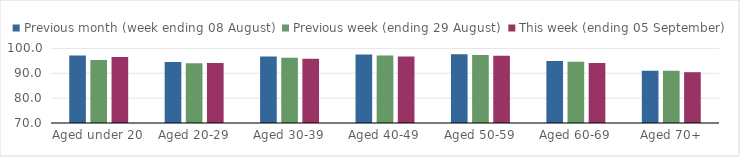
| Category | Previous month (week ending 08 August) | Previous week (ending 29 August) | This week (ending 05 September) |
|---|---|---|---|
| Aged under 20 | 97.14 | 95.33 | 96.56 |
| Aged 20-29 | 94.51 | 94.06 | 94.1 |
| Aged 30-39 | 96.75 | 96.28 | 95.89 |
| Aged 40-49 | 97.51 | 97.16 | 96.72 |
| Aged 50-59 | 97.68 | 97.39 | 97.03 |
| Aged 60-69 | 94.94 | 94.6 | 94.18 |
| Aged 70+ | 91.06 | 91.04 | 90.44 |